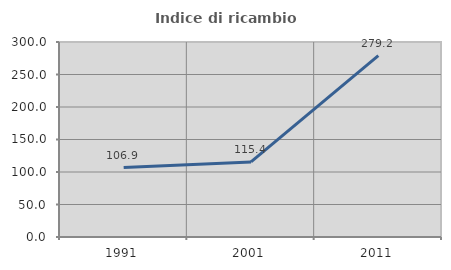
| Category | Indice di ricambio occupazionale  |
|---|---|
| 1991.0 | 106.859 |
| 2001.0 | 115.436 |
| 2011.0 | 279.191 |